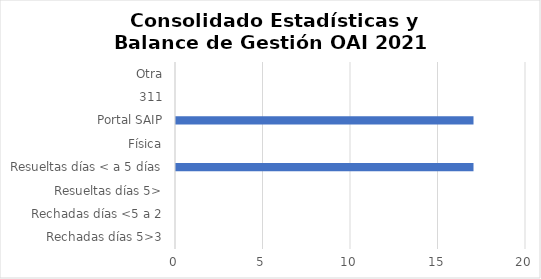
| Category | Series 0 |
|---|---|
| Rechadas días 5>3 | 0 |
| Rechadas días <5 a 2 | 0 |
| Resueltas días 5> | 0 |
| Resueltas días < a 5 días | 17 |
| Física | 0 |
| Portal SAIP | 17 |
| 311 | 0 |
| Otra | 0 |